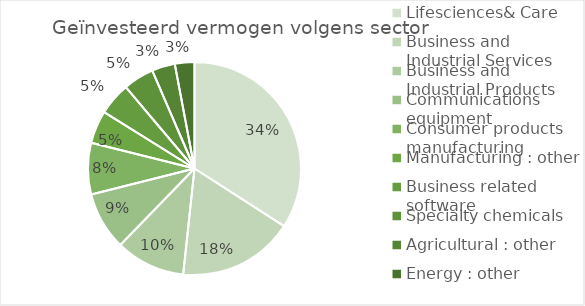
| Category | Series 0 |
|---|---|
| Lifesciences& Care | 74.852 |
| Business and Industrial Services | 38.609 |
| Business and Industrial Products | 23.191 |
| Communications equipment | 19.336 |
| Consumer products manufacturing | 17.172 |
| Manufacturing : other | 10.923 |
| Business related software | 10.914 |
| Specialty chemicals | 10.27 |
| Agricultural : other | 7.7 |
| Energy : other | 6.52 |